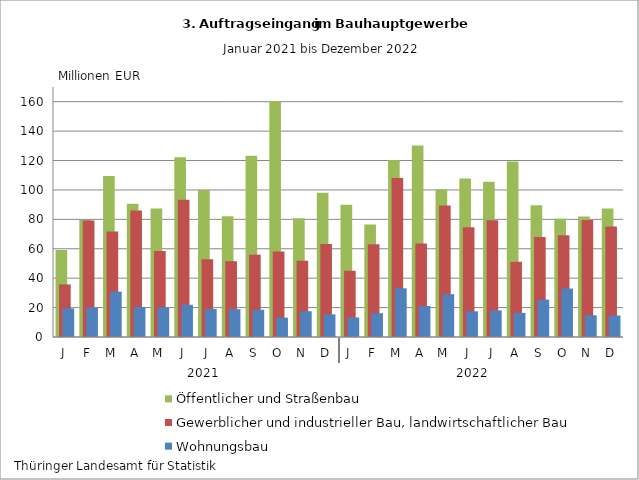
| Category | Öffentlicher und Straßenbau | Gewerblicher und industrieller Bau, landwirtschaftlicher Bau | Wohnungsbau |
|---|---|---|---|
| J | 59.109 | 35.77 | 19.421 |
| F | 79.576 | 79.228 | 20.073 |
| M | 109.533 | 71.656 | 30.863 |
| A | 90.552 | 86.092 | 20.386 |
| M | 87.369 | 58.552 | 20.211 |
| J | 122.263 | 93.332 | 21.901 |
| J | 100.013 | 52.948 | 19.043 |
| A | 82.176 | 51.546 | 18.899 |
| S | 123.226 | 55.994 | 18.476 |
| O | 160.412 | 58.167 | 13.169 |
| N | 80.68 | 51.865 | 17.514 |
| D | 98.174 | 63.292 | 15.409 |
| J | 89.898 | 45.03 | 13.303 |
| F | 76.468 | 63.016 | 16.201 |
| M | 120.415 | 108.104 | 33.096 |
| A | 130.248 | 63.544 | 21.098 |
| M | 100.219 | 89.431 | 29.118 |
| J | 107.714 | 74.595 | 17.457 |
| J | 105.492 | 79.466 | 18.073 |
| A | 119.395 | 51.153 | 16.405 |
| S | 89.568 | 68.016 | 25.412 |
| O | 80.379 | 69.241 | 32.933 |
| N | 81.901 | 79.61 | 14.737 |
| D | 87.459 | 75.055 | 14.652 |